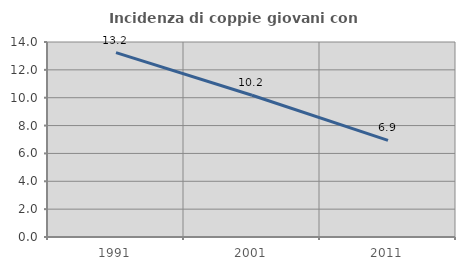
| Category | Incidenza di coppie giovani con figli |
|---|---|
| 1991.0 | 13.237 |
| 2001.0 | 10.178 |
| 2011.0 | 6.938 |